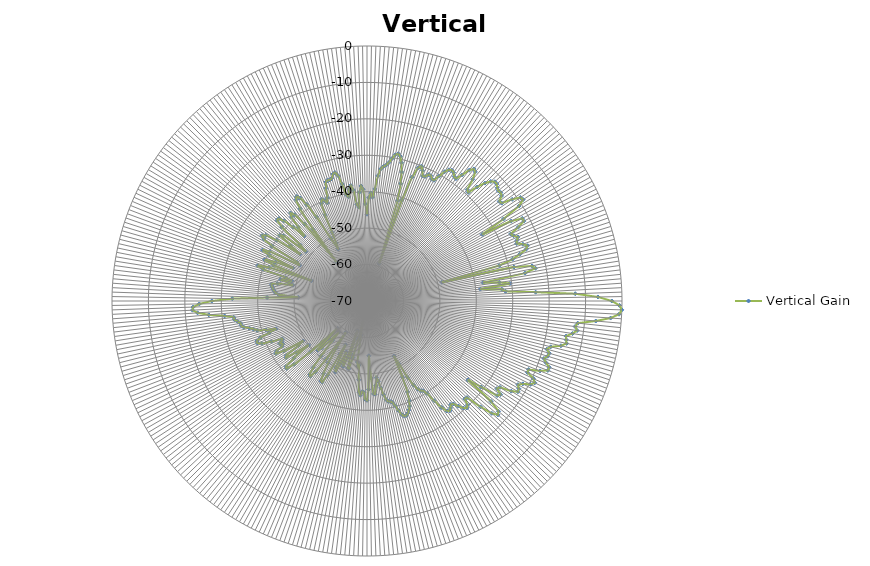
| Category | Vertical Gain | Series 1 |
|---|---|---|
| 0 | -46.18 |  |
| 1 | -41.6 |  |
| 2 | -40.36 |  |
| 3 | -41.45 |  |
| 4 | -39.16 |  |
| 5 | -35.48 |  |
| 6 | -33.52 |  |
| 7 | -32.78 |  |
| 8 | -32.34 |  |
| 9 | -31.52 |  |
| 10 | -30.26 |  |
| 11 | -29.1 |  |
| 12 | -28.67 |  |
| 13 | -29.26 |  |
| 14 | -30.9 |  |
| 15 | -33.35 |  |
| 16 | -36.47 |  |
| 17 | -41.14 |  |
| 18 | -59.13 |  |
| 19 | -40.67 |  |
| 20 | -33.81 |  |
| 21 | -30.8 |  |
| 22 | -30.08 |  |
| 23 | -31.05 |  |
| 24 | -32.46 |  |
| 25 | -32.29 |  |
| 26 | -31.39 |  |
| 27 | -31.38 |  |
| 28 | -32.13 |  |
| 29 | -32.1 |  |
| 30 | -30.41 |  |
| 31 | -28.6 |  |
| 32 | -27.54 |  |
| 33 | -27.19 |  |
| 34 | -27.48 |  |
| 35 | -28.27 |  |
| 36 | -28.47 |  |
| 37 | -26.66 |  |
| 38 | -24.45 |  |
| 39 | -23.36 |  |
| 40 | -23.75 |  |
| 41 | -25.74 |  |
| 42 | -28.85 |  |
| 43 | -29.25 |  |
| 44 | -26.5 |  |
| 45 | -24.23 |  |
| 46 | -22.76 |  |
| 47 | -22.01 |  |
| 48 | -22.04 |  |
| 49 | -22.63 |  |
| 50 | -22.95 |  |
| 51 | -22.77 |  |
| 52 | -23.14 |  |
| 53 | -24.51 |  |
| 54 | -24.28 |  |
| 55 | -21.33 |  |
| 56 | -19.19 |  |
| 57 | -18.89 |  |
| 58 | -20.82 |  |
| 59 | -26.29 |  |
| 60 | -33.47 |  |
| 61 | -24.78 |  |
| 62 | -21.71 |  |
| 63 | -21.69 |  |
| 64 | -23.84 |  |
| 65 | -26.49 |  |
| 66 | -25.95 |  |
| 67 | -25.01 |  |
| 68 | -25.63 |  |
| 69 | -25.98 |  |
| 70 | -24.44 |  |
| 71 | -23.4 |  |
| 72 | -24.09 |  |
| 73 | -26.14 |  |
| 74 | -28.47 |  |
| 75 | -32.42 |  |
| 76 | -48.81 |  |
| 77 | -28.61 |  |
| 78 | -23.67 |  |
| 79 | -22.9 |  |
| 80 | -25.95 |  |
| 81 | -37.75 |  |
| 82 | -33.33 |  |
| 83 | -30.5 |  |
| 84 | -38.71 |  |
| 85 | -32.84 |  |
| 86 | -31.88 |  |
| 87 | -23.64 |  |
| 88 | -12.8 |  |
| 89 | -6.59 |  |
| 90 | -2.78 |  |
| 91 | -0.67 |  |
| 92 | 0 |  |
| 93 | -0.72 |  |
| 94 | -2.96 |  |
| 95 | -6.96 |  |
| 96 | -11.83 |  |
| 97 | -12.44 |  |
| 98 | -11.75 |  |
| 99 | -12.89 |  |
| 100 | -14.51 |  |
| 101 | -14.3 |  |
| 102 | -13.99 |  |
| 103 | -15.36 |  |
| 104 | -18.02 |  |
| 105 | -18.87 |  |
| 106 | -17.94 |  |
| 107 | -18.16 |  |
| 108 | -18.93 |  |
| 109 | -18.06 |  |
| 110 | -16.76 |  |
| 111 | -16.83 |  |
| 112 | -18.76 |  |
| 113 | -21.82 |  |
| 114 | -21.8 |  |
| 115 | -19.6 |  |
| 116 | -18.76 |  |
| 117 | -19.6 |  |
| 118 | -21.54 |  |
| 119 | -22.62 |  |
| 120 | -21.88 |  |
| 121 | -21.66 |  |
| 122 | -23.29 |  |
| 123 | -26.48 |  |
| 124 | -26.99 |  |
| 125 | -25.25 |  |
| 126 | -25.84 |  |
| 127 | -30.78 |  |
| 128 | -34.81 |  |
| 129 | -26.17 |  |
| 130 | -22.89 |  |
| 131 | -22.37 |  |
| 132 | -23.9 |  |
| 133 | -27.4 |  |
| 134 | -31.83 |  |
| 135 | -32.02 |  |
| 136 | -30.3 |  |
| 137 | -29.84 |  |
| 138 | -30.47 |  |
| 139 | -31.77 |  |
| 140 | -33.12 |  |
| 141 | -33.45 |  |
| 142 | -32.75 |  |
| 143 | -32.24 |  |
| 144 | -32.68 |  |
| 145 | -34.31 |  |
| 146 | -36.99 |  |
| 147 | -39.74 |  |
| 148 | -40.95 |  |
| 149 | -41.27 |  |
| 150 | -42.03 |  |
| 151 | -43.57 |  |
| 152 | -46.17 |  |
| 153 | -50.67 |  |
| 154 | -53.21 |  |
| 155 | -46.95 |  |
| 156 | -42.71 |  |
| 157 | -40.31 |  |
| 158 | -38.89 |  |
| 159 | -37.95 |  |
| 160 | -37.22 |  |
| 161 | -36.76 |  |
| 162 | -36.77 |  |
| 163 | -37.44 |  |
| 164 | -38.75 |  |
| 165 | -40.27 |  |
| 166 | -41.33 |  |
| 167 | -41.67 |  |
| 168 | -41.8 |  |
| 169 | -42.43 |  |
| 170 | -43.89 |  |
| 171 | -45.85 |  |
| 172 | -47.75 |  |
| 173 | -48.77 |  |
| 174 | -46.67 |  |
| 175 | -44.3 |  |
| 176 | -44.44 |  |
| 177 | -48.8 |  |
| 178 | -54.97 |  |
| 179 | -45.72 |  |
| 180 | -42.74 |  |
| 181 | -43.02 |  |
| 182 | -44.9 |  |
| 183 | -45.11 |  |
| 184 | -44.1 |  |
| 185 | -44.86 |  |
| 186 | -48.25 |  |
| 187 | -52.34 |  |
| 188 | -51.88 |  |
| 189 | -53.05 |  |
| 190 | -60.54 |  |
| 191 | -66.88 |  |
| 192 | -59.8 |  |
| 193 | -59.19 |  |
| 194 | -54.01 |  |
| 195 | -50.74 |  |
| 196 | -50.8 |  |
| 197 | -54.83 |  |
| 198 | -61.5 |  |
| 199 | -53.61 |  |
| 200 | -50.9 |  |
| 201 | -52.17 |  |
| 202 | -54.9 |  |
| 203 | -51.24 |  |
| 204 | -48.63 |  |
| 205 | -49.73 |  |
| 206 | -56.63 |  |
| 207 | -53.57 |  |
| 208 | -46.81 |  |
| 209 | -44.53 |  |
| 210 | -44.72 |  |
| 211 | -46.72 |  |
| 212 | -49.91 |  |
| 213 | -54.62 |  |
| 214 | -59.64 |  |
| 215 | -50.64 |  |
| 216 | -45.89 |  |
| 217 | -44.12 |  |
| 218 | -44.42 |  |
| 219 | -46.52 |  |
| 220 | -50.36 |  |
| 221 | -55.69 |  |
| 222 | -58.53 |  |
| 223 | -55.28 |  |
| 224 | -52.08 |  |
| 225 | -50.83 |  |
| 226 | -52.83 |  |
| 227 | -58.95 |  |
| 228 | -49.16 |  |
| 229 | -43.46 |  |
| 230 | -41.15 |  |
| 231 | -41.4 |  |
| 232 | -44.53 |  |
| 233 | -49.92 |  |
| 234 | -45.99 |  |
| 235 | -42.88 |  |
| 236 | -43.32 |  |
| 237 | -47.58 |  |
| 238 | -49.31 |  |
| 239 | -43.38 |  |
| 240 | -41.09 |  |
| 241 | -41.58 |  |
| 242 | -43.58 |  |
| 243 | -44.06 |  |
| 244 | -43.38 |  |
| 245 | -44.23 |  |
| 246 | -44.51 |  |
| 247 | -41.47 |  |
| 248 | -38.88 |  |
| 249 | -37.77 |  |
| 250 | -37.82 |  |
| 251 | -39.01 |  |
| 252 | -41.75 |  |
| 253 | -43.92 |  |
| 254 | -41.15 |  |
| 255 | -38.82 |  |
| 256 | -37.92 |  |
| 257 | -36.86 |  |
| 258 | -35.41 |  |
| 259 | -34.8 |  |
| 260 | -34.77 |  |
| 261 | -34.06 |  |
| 262 | -33.28 |  |
| 263 | -33.13 |  |
| 264 | -30.69 |  |
| 265 | -26.41 |  |
| 266 | -23.38 |  |
| 267 | -22.02 |  |
| 268 | -22.22 |  |
| 269 | -23.96 |  |
| 270 | -27.39 |  |
| 271 | -33.01 |  |
| 272 | -42.55 |  |
| 273 | -51.09 |  |
| 274 | -45.76 |  |
| 275 | -44.82 |  |
| 276 | -44.48 |  |
| 277 | -44.02 |  |
| 278 | -43.82 |  |
| 279 | -43.54 |  |
| 280 | -43.4 |  |
| 281 | -44.93 |  |
| 282 | -49.22 |  |
| 283 | -48.13 |  |
| 284 | -45.58 |  |
| 285 | -48.65 |  |
| 286 | -46.78 |  |
| 287 | -40.14 |  |
| 288 | -38.47 |  |
| 289 | -41.48 |  |
| 290 | -53.75 |  |
| 291 | -42.52 |  |
| 292 | -39.68 |  |
| 293 | -42.68 |  |
| 294 | -47.78 |  |
| 295 | -40.38 |  |
| 296 | -38.09 |  |
| 297 | -40.05 |  |
| 298 | -49.09 |  |
| 299 | -47.94 |  |
| 300 | -39.81 |  |
| 301 | -36.94 |  |
| 302 | -36.07 |  |
| 303 | -36.87 |  |
| 304 | -40.12 |  |
| 305 | -47.58 |  |
| 306 | -44.01 |  |
| 307 | -40.03 |  |
| 308 | -40.87 |  |
| 309 | -48.46 |  |
| 310 | -46.07 |  |
| 311 | -39.01 |  |
| 312 | -36.85 |  |
| 313 | -36.85 |  |
| 314 | -38.29 |  |
| 315 | -41.33 |  |
| 316 | -45.18 |  |
| 317 | -42.34 |  |
| 318 | -38.99 |  |
| 319 | -38 |  |
| 320 | -39.06 |  |
| 321 | -42.81 |  |
| 322 | -56.37 |  |
| 323 | -45.39 |  |
| 324 | -38.7 |  |
| 325 | -36.04 |  |
| 326 | -35.41 |  |
| 327 | -36.31 |  |
| 328 | -38.74 |  |
| 329 | -43.1 |  |
| 330 | -50.17 |  |
| 331 | -53.71 |  |
| 332 | -51.99 |  |
| 333 | -48.88 |  |
| 334 | -43.69 |  |
| 335 | -40.46 |  |
| 336 | -39.4 |  |
| 337 | -40.04 |  |
| 338 | -40.94 |  |
| 339 | -39.58 |  |
| 340 | -37.07 |  |
| 341 | -35.45 |  |
| 342 | -35.04 |  |
| 343 | -35.27 |  |
| 344 | -34.91 |  |
| 345 | -33.94 |  |
| 346 | -33.65 |  |
| 347 | -34.69 |  |
| 348 | -37.15 |  |
| 349 | -40.31 |  |
| 350 | -40.95 |  |
| 351 | -38.91 |  |
| 352 | -37.97 |  |
| 353 | -39.32 |  |
| 354 | -43.32 |  |
| 355 | -44.11 |  |
| 356 | -40.07 |  |
| 357 | -38.39 |  |
| 358 | -39.32 |  |
| 359 | -43.34 |  |